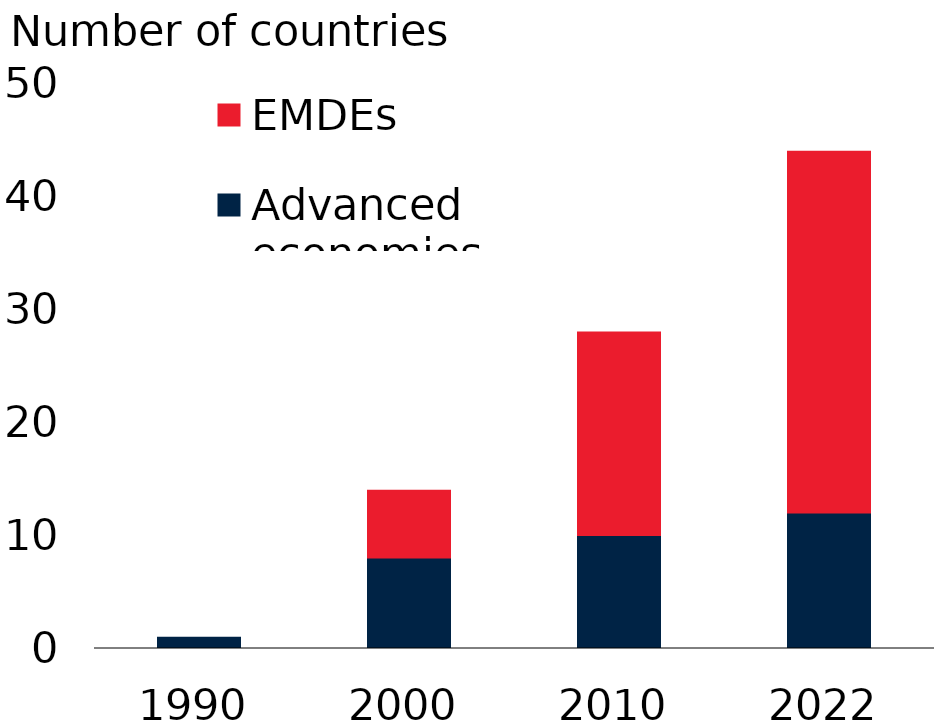
| Category | Advanced economies | EMDEs |
|---|---|---|
| 1990.0 | 1 | 0 |
| 2000.0 | 8 | 6 |
| 2010.0 | 10 | 18 |
| 2022.0 | 12 | 32 |